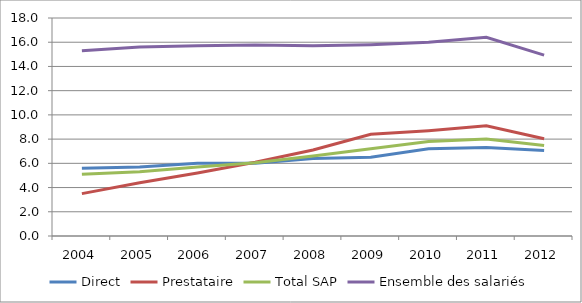
| Category | Direct | Prestataire | Total SAP | Ensemble des salariés |
|---|---|---|---|---|
| 2004.0 | 5.6 | 3.5 | 5.1 | 15.3 |
| 2005.0 | 5.7 | 4.4 | 5.3 | 15.6 |
| 2006.0 | 6 | 5.2 | 5.7 | 15.7 |
| 2007.0 | 6.017 | 6.091 | 6.043 | 15.777 |
| 2008.0 | 6.4 | 7.1 | 6.6 | 15.7 |
| 2009.0 | 6.5 | 8.4 | 7.2 | 15.8 |
| 2010.0 | 7.2 | 8.7 | 7.8 | 16 |
| 2011.0 | 7.3 | 9.1 | 8 | 16.4 |
| 2012.0 | 7.056 | 8.035 | 7.464 | 14.931 |